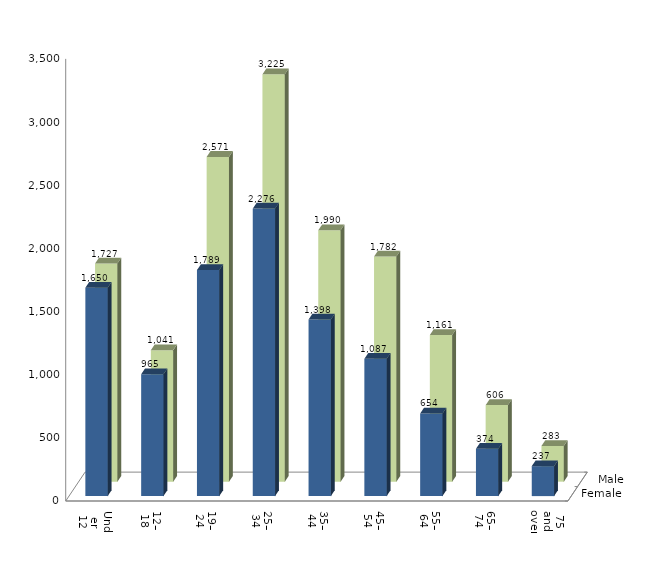
| Category | Female | Male |
|---|---|---|
| Under 12 | 1650 | 1727 |
| 12–18 | 965 | 1041 |
| 19–24 | 1789 | 2571 |
| 25–34 | 2276 | 3225 |
| 35–44 | 1398 | 1990 |
| 45–54 | 1087 | 1782 |
| 55–64 | 654 | 1161 |
| 65–74 | 374 | 606 |
| 75 and over | 237 | 283 |